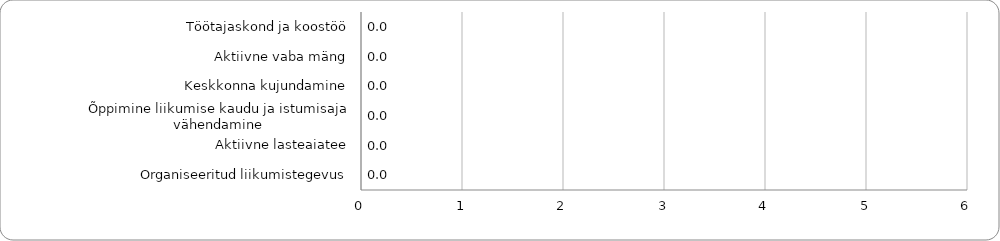
| Category | Series 0 |
|---|---|
| Töötajaskond ja koostöö | 0 |
| Aktiivne vaba mäng | 0 |
| Keskkonna kujundamine | 0 |
| Õppimine liikumise kaudu ja istumisaja vähendamine | 0 |
| Aktiivne lasteaiatee | 0 |
| Organiseeritud liikumistegevus | 0 |